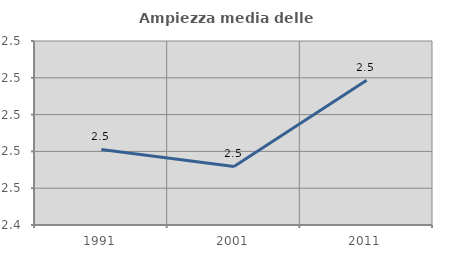
| Category | Ampiezza media delle famiglie |
|---|---|
| 1991.0 | 2.481 |
| 2001.0 | 2.472 |
| 2011.0 | 2.519 |